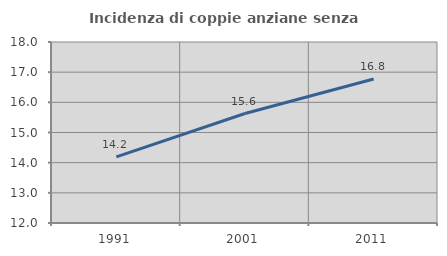
| Category | Incidenza di coppie anziane senza figli  |
|---|---|
| 1991.0 | 14.193 |
| 2001.0 | 15.63 |
| 2011.0 | 16.775 |